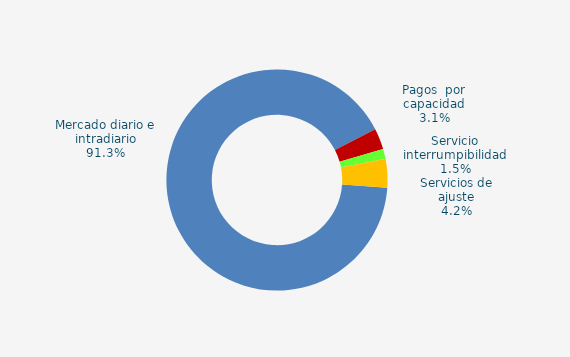
| Category | Series 0 |
|---|---|
| Mercado diario e intradiario | 64.95 |
| Pagos  por capacidad | 2.19 |
| Servicio interrumpibilidad | 1.04 |
| Servicios de ajuste | 2.97 |